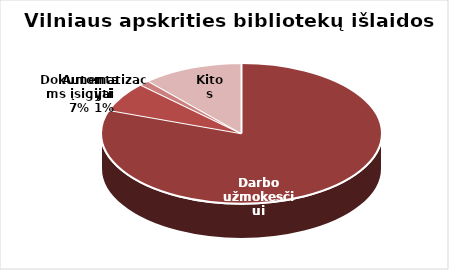
| Category | Series 0 |
|---|---|
| Darbo užmokesčiui | 5644991 |
| Dokumentams įsigyti | 478949 |
| Automatizacijai | 84408 |
| Kitos | 813170 |